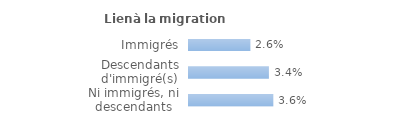
| Category | Series 0 |
|---|---|
| Immigrés | 0.026 |
| Descendants d'immigré(s) | 0.034 |
| Ni immigrés, ni descendants | 0.036 |